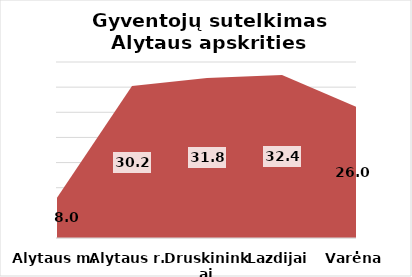
| Category | Series 0 |
|---|---|
| Alytaus m. | 7.99 |
| Alytaus r. | 30.22 |
| Druskininkai | 31.84 |
| Lazdijai | 32.4 |
| Varėna | 26.03 |